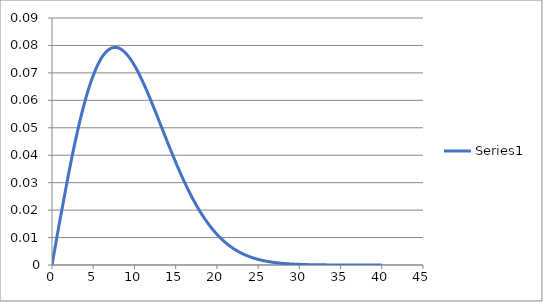
| Category | Series 0 |
|---|---|
| 0.0 | 0 |
| 1.0 | 0.017 |
| 2.0 | 0.033 |
| 3.0 | 0.048 |
| 4.0 | 0.06 |
| 5.0 | 0.069 |
| 6.0 | 0.075 |
| 7.0 | 0.079 |
| 8.0 | 0.079 |
| 9.0 | 0.077 |
| 10.0 | 0.073 |
| 11.0 | 0.067 |
| 12.0 | 0.06 |
| 13.0 | 0.052 |
| 14.0 | 0.045 |
| 15.0 | 0.037 |
| 16.0 | 0.031 |
| 17.0 | 0.025 |
| 18.0 | 0.019 |
| 19.0 | 0.015 |
| 20.0 | 0.011 |
| 21.0 | 0.008 |
| 22.0 | 0.006 |
| 23.0 | 0.004 |
| 24.0 | 0.003 |
| 25.0 | 0.002 |
| 26.0 | 0.001 |
| 27.0 | 0.001 |
| 28.0 | 0.001 |
| 29.0 | 0 |
| 30.0 | 0 |
| 31.0 | 0 |
| 32.0 | 0 |
| 33.0 | 0 |
| 34.0 | 0 |
| 35.0 | 0 |
| 36.0 | 0 |
| 37.0 | 0 |
| 38.0 | 0 |
| 39.0 | 0 |
| 40.0 | 0 |